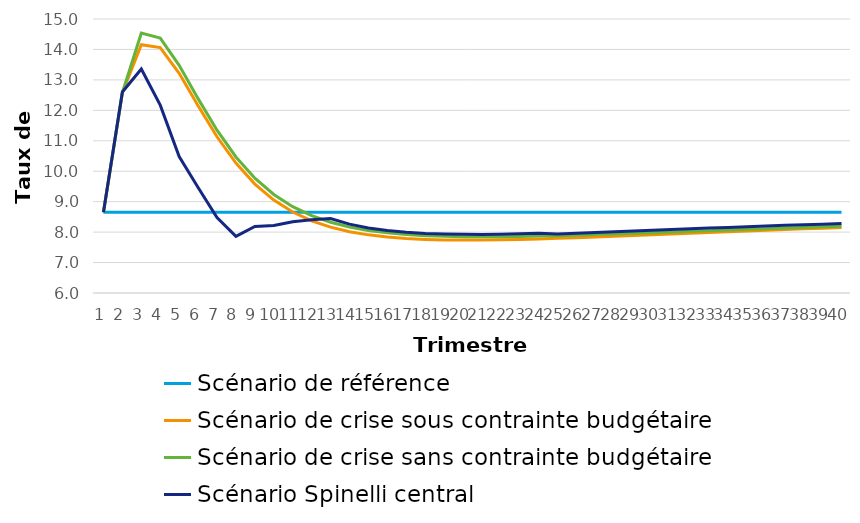
| Category | Scénario de référence | Scénario de crise sous contrainte budgétaire | Scénario de crise sans contrainte budgétaire | Scénario Spinelli central |
|---|---|---|---|---|
| 0 | 8.654 | 8.654 | 8.654 | 8.654 |
| 1 | 8.654 | 12.583 | 12.583 | 12.603 |
| 2 | 8.654 | 14.155 | 14.535 | 13.356 |
| 3 | 8.654 | 14.059 | 14.371 | 12.17 |
| 4 | 8.654 | 13.215 | 13.479 | 10.481 |
| 5 | 8.654 | 12.15 | 12.384 | 9.465 |
| 6 | 8.654 | 11.132 | 11.347 | 8.48 |
| 7 | 8.654 | 10.267 | 10.469 | 7.861 |
| 8 | 8.654 | 9.578 | 9.77 | 8.183 |
| 9 | 8.654 | 9.052 | 9.235 | 8.215 |
| 10 | 8.654 | 8.659 | 8.835 | 8.339 |
| 11 | 8.654 | 8.372 | 8.539 | 8.405 |
| 12 | 8.654 | 8.163 | 8.323 | 8.447 |
| 13 | 8.654 | 8.014 | 8.167 | 8.262 |
| 14 | 8.654 | 7.91 | 8.055 | 8.137 |
| 15 | 8.654 | 7.837 | 7.975 | 8.051 |
| 16 | 8.654 | 7.789 | 7.92 | 7.993 |
| 17 | 8.654 | 7.759 | 7.884 | 7.956 |
| 18 | 8.654 | 7.743 | 7.861 | 7.935 |
| 19 | 8.654 | 7.737 | 7.85 | 7.926 |
| 20 | 8.654 | 7.739 | 7.846 | 7.925 |
| 21 | 8.654 | 7.747 | 7.849 | 7.932 |
| 22 | 8.654 | 7.76 | 7.857 | 7.944 |
| 23 | 8.654 | 7.777 | 7.868 | 7.96 |
| 24 | 8.654 | 7.796 | 7.883 | 7.938 |
| 25 | 8.654 | 7.817 | 7.9 | 7.965 |
| 26 | 8.654 | 7.84 | 7.918 | 7.988 |
| 27 | 8.654 | 7.864 | 7.938 | 8.012 |
| 28 | 8.654 | 7.888 | 7.959 | 8.036 |
| 29 | 8.654 | 7.913 | 7.981 | 8.06 |
| 30 | 8.654 | 7.938 | 8.003 | 8.084 |
| 31 | 8.654 | 7.964 | 8.025 | 8.108 |
| 32 | 8.654 | 7.989 | 8.047 | 8.132 |
| 33 | 8.654 | 8.013 | 8.069 | 8.155 |
| 34 | 8.654 | 8.038 | 8.091 | 8.178 |
| 35 | 8.654 | 8.062 | 8.112 | 8.2 |
| 36 | 8.654 | 8.085 | 8.133 | 8.221 |
| 37 | 8.654 | 8.108 | 8.154 | 8.242 |
| 38 | 8.654 | 8.13 | 8.174 | 8.262 |
| 39 | 8.654 | 8.151 | 8.193 | 8.282 |